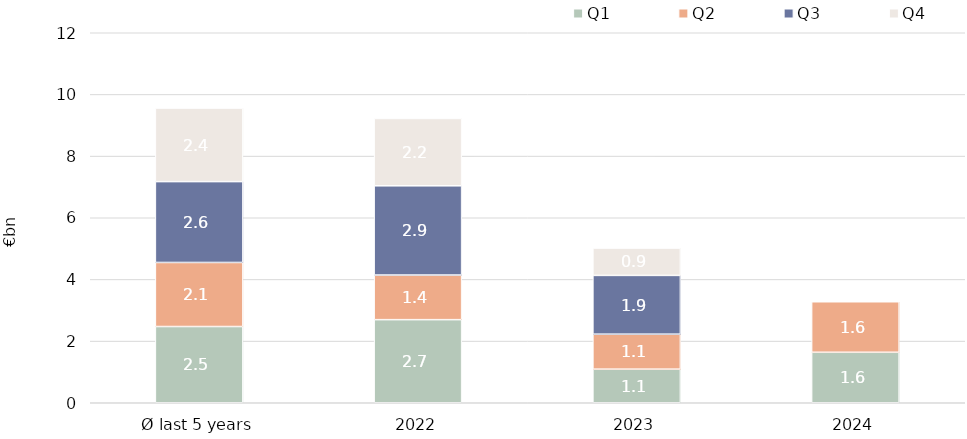
| Category | Q1 | Q2 | Q3 | Q4 |
|---|---|---|---|---|
| Ø last 5 years | 2472435371.6 | 2077545286.94 | 2622535716.024 | 2384745346.318 |
| 2022 | 2695170195.57 | 1447397830.99 | 2894255899.38 | 2183546723 |
| 2023 | 1089552950 | 1134957048.99 | 1905749413.3 | 886112513 |
| 2024 | 1637089070 | 1638815458 | 0 | 0 |